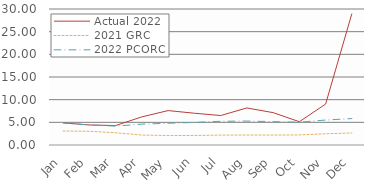
| Category | Actual 2022 | 2021 GRC | 2022 PCORC |
|---|---|---|---|
| Jan | 4.87 | 3.084 | 4.87 |
| Feb | 4.421 | 3.026 | 4.421 |
| Mar | 4.289 | 2.705 | 4.164 |
| Apr | 6.207 | 2.185 | 4.606 |
| May | 7.591 | 2.094 | 4.797 |
| Jun | 7.01 | 2.099 | 4.981 |
| Jul | 6.498 | 2.185 | 5.231 |
| Aug | 8.175 | 2.198 | 5.28 |
| Sep | 7.135 | 2.195 | 5.15 |
| Oct | 5.137 | 2.217 | 5.021 |
| Nov | 9.031 | 2.472 | 5.506 |
| Dec | 28.985 | 2.65 | 5.83 |